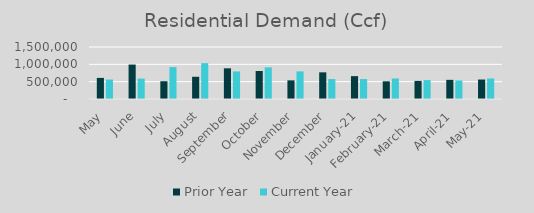
| Category | Prior Year | Current Year |
|---|---|---|
| May | 608563.54 | 561680.927 |
| June | 993563.54 | 588815.728 |
| July | 512849.55 | 920418.723 |
| August | 641515.25 | 1034271.241 |
| September | 884745.885 | 795392.365 |
| October | 808030.57 | 913450.318 |
| November | 537591.016 | 796803.85 |
| December | 768795.205 | 575698.992 |
| January-21 | 659359.876 | 574964.407 |
| February-21 | 510296.309 | 591912.627 |
| March-21 | 521598.856 | 545392.69 |
| April-21 | 552550.404 | 533967.423 |
| May-21 | 561680.927 | 591911.753 |